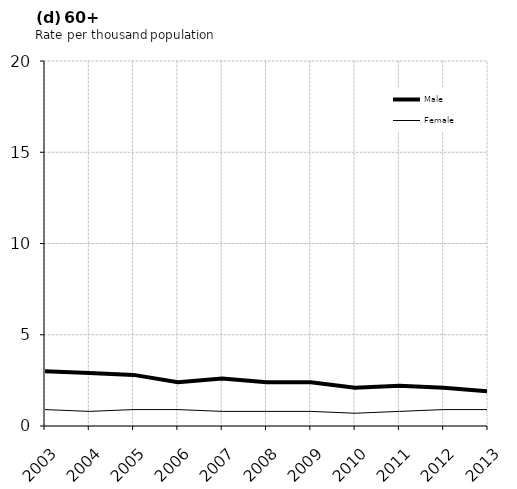
| Category | Male | Female |
|---|---|---|
| 2003.0 | 3 | 0.9 |
| 2004.0 | 2.9 | 0.8 |
| 2005.0 | 2.8 | 0.9 |
| 2006.0 | 2.4 | 0.9 |
| 2007.0 | 2.6 | 0.8 |
| 2008.0 | 2.4 | 0.8 |
| 2009.0 | 2.4 | 0.8 |
| 2010.0 | 2.1 | 0.7 |
| 2011.0 | 2.2 | 0.8 |
| 2012.0 | 2.1 | 0.9 |
| 2013.0 | 1.9 | 0.9 |